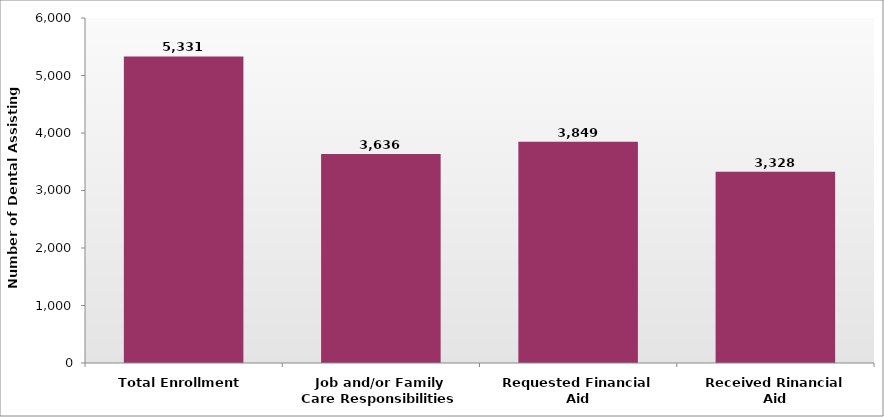
| Category | number of dental assisting students |
|---|---|
| Total Enrollment | 5331 |
| Job and/or Family Care Responsibilities | 3636 |
| Requested Financial Aid | 3849 |
| Received Rinancial Aid | 3328 |